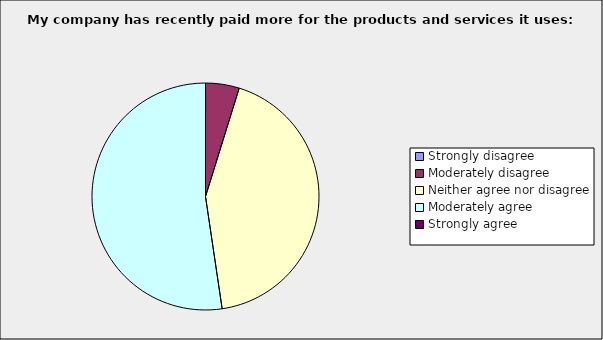
| Category | Series 0 |
|---|---|
| Strongly disagree | 0 |
| Moderately disagree | 0.048 |
| Neither agree nor disagree | 0.429 |
| Moderately agree | 0.524 |
| Strongly agree | 0 |